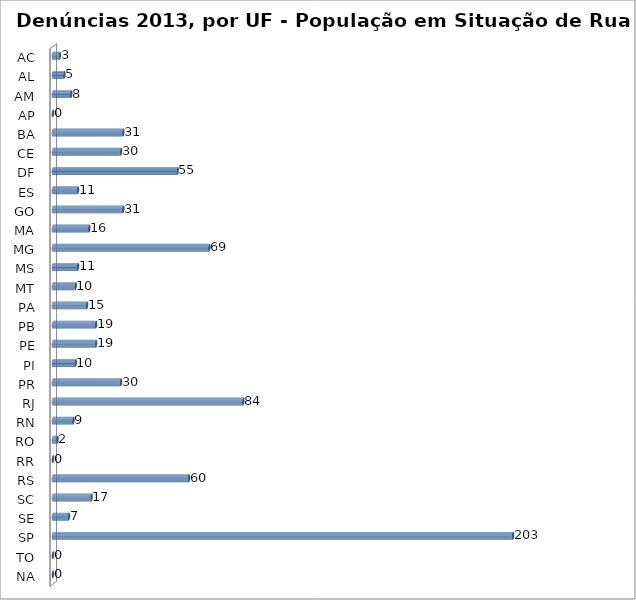
| Category | Series 0 |
|---|---|
| AC | 3 |
| AL | 5 |
| AM | 8 |
| AP | 0 |
| BA | 31 |
| CE | 30 |
| DF | 55 |
| ES | 11 |
| GO | 31 |
| MA | 16 |
| MG | 69 |
| MS | 11 |
| MT | 10 |
| PA | 15 |
| PB | 19 |
| PE | 19 |
| PI | 10 |
| PR | 30 |
| RJ | 84 |
| RN | 9 |
| RO | 2 |
| RR | 0 |
| RS | 60 |
| SC | 17 |
| SE | 7 |
| SP | 203 |
| TO | 0 |
| NA | 0 |